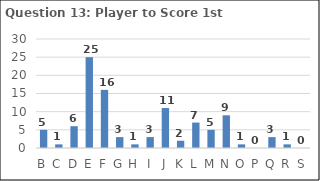
| Category | Series 0 |
|---|---|
| B | 5 |
| C | 1 |
| D | 6 |
| E | 25 |
| F | 16 |
| G | 3 |
| H | 1 |
| I | 3 |
| J | 11 |
| K | 2 |
| L | 7 |
| M | 5 |
| N | 9 |
| O | 1 |
| P | 0 |
| Q | 3 |
| R | 1 |
| S | 0 |